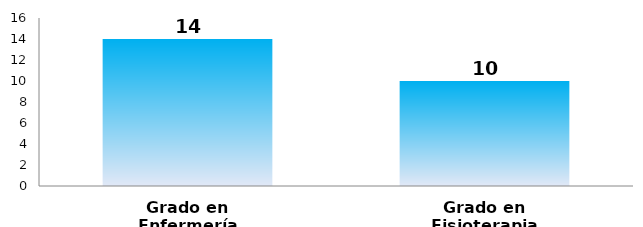
| Category | Series 0 |
|---|---|
| Grado en Enfermería | 14 |
| Grado en Fisioterapia | 10 |